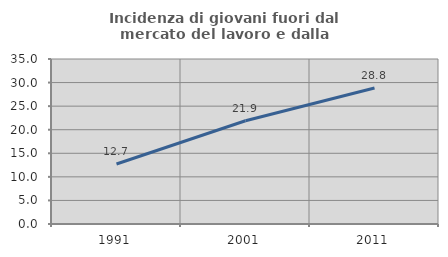
| Category | Incidenza di giovani fuori dal mercato del lavoro e dalla formazione  |
|---|---|
| 1991.0 | 12.721 |
| 2001.0 | 21.905 |
| 2011.0 | 28.846 |